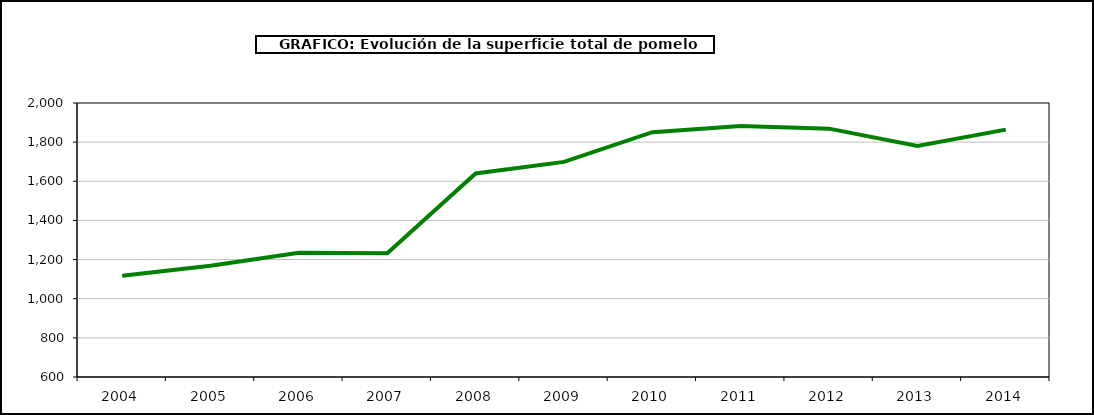
| Category | superficie |
|---|---|
| 2004.0 | 1117 |
| 2005.0 | 1168 |
| 2006.0 | 1235 |
| 2007.0 | 1232 |
| 2008.0 | 1640 |
| 2009.0 | 1699 |
| 2010.0 | 1851 |
| 2011.0 | 1882 |
| 2012.0 | 1869 |
| 2013.0 | 1781 |
| 2014.0 | 1864 |